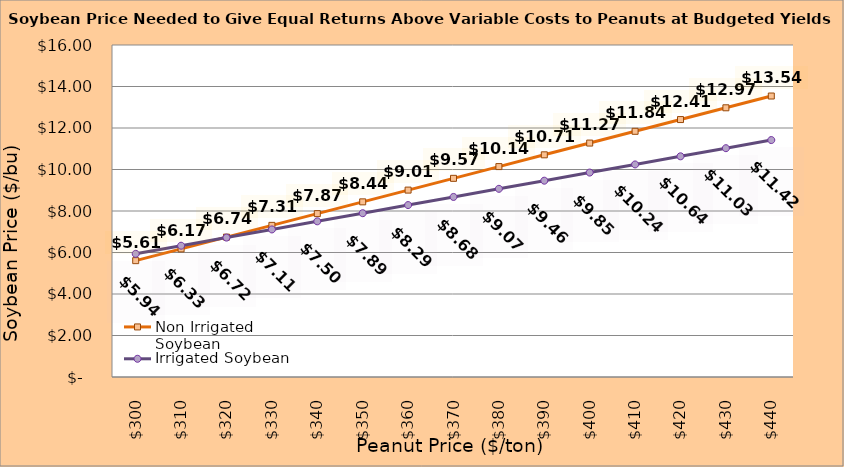
| Category | Non Irrigated Soybean | Irrigated Soybean |
|---|---|---|
| 299.8936170212766 | 5.607 | 5.936 |
| 309.8936170212766 | 6.174 | 6.327 |
| 319.8936170212766 | 6.741 | 6.719 |
| 329.8936170212766 | 7.307 | 7.111 |
| 339.8936170212766 | 7.874 | 7.502 |
| 349.8936170212766 | 8.441 | 7.894 |
| 359.8936170212766 | 9.007 | 8.286 |
| 369.8936170212766 | 9.574 | 8.677 |
| 379.8936170212766 | 10.141 | 9.069 |
| 389.8936170212766 | 10.707 | 9.461 |
| 399.8936170212766 | 11.274 | 9.852 |
| 409.8936170212766 | 11.841 | 10.244 |
| 419.8936170212766 | 12.407 | 10.636 |
| 429.8936170212766 | 12.974 | 11.027 |
| 439.8936170212766 | 13.541 | 11.419 |